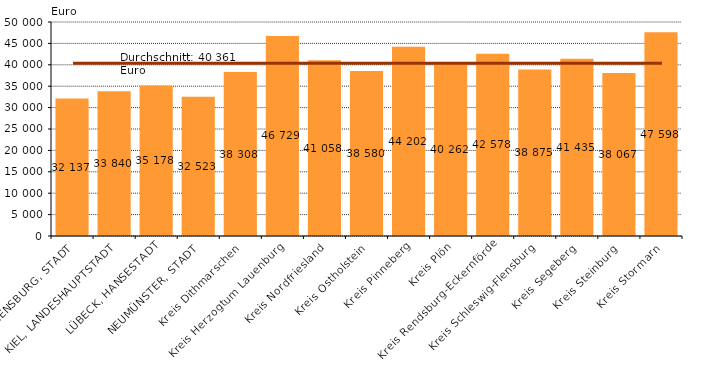
| Category | Series 0 |
|---|---|
| FLENSBURG, STADT | 32137 |
| KIEL, LANDESHAUPTSTADT | 33840 |
| LÜBECK, HANSESTADT | 35178 |
| NEUMÜNSTER, STADT | 32523 |
| Kreis Dithmarschen | 38308 |
| Kreis Herzogtum Lauenburg | 46729 |
| Kreis Nordfriesland | 41058 |
| Kreis Ostholstein | 38580 |
| Kreis Pinneberg | 44202 |
| Kreis Plön | 40262 |
| Kreis Rendsburg-Eckernförde | 42578 |
| Kreis Schleswig-Flensburg | 38875 |
| Kreis Segeberg | 41435 |
| Kreis Steinburg | 38067 |
| Kreis Stormarn | 47598 |